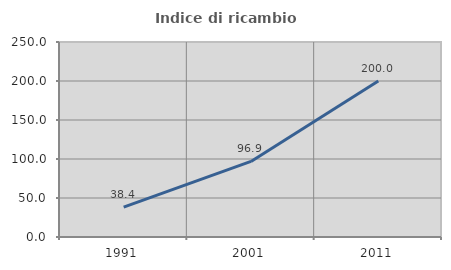
| Category | Indice di ricambio occupazionale  |
|---|---|
| 1991.0 | 38.393 |
| 2001.0 | 96.875 |
| 2011.0 | 200 |